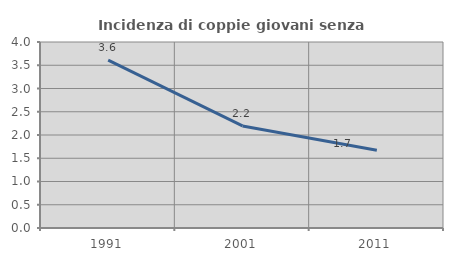
| Category | Incidenza di coppie giovani senza figli |
|---|---|
| 1991.0 | 3.608 |
| 2001.0 | 2.195 |
| 2011.0 | 1.671 |